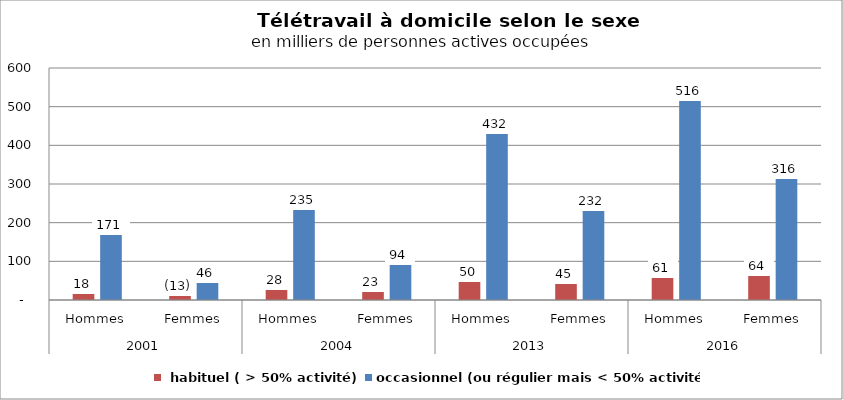
| Category |  habituel ( > 50% activité) | occasionnel (ou régulier mais < 50% activité) |
|---|---|---|
| 0 | 18.319 | 170.561 |
| 1 | 13.027 | 46.392 |
| 2 | 28.41 | 235.487 |
| 3 | 23.255 | 93.541 |
| 4 | 49.817 | 431.872 |
| 5 | 44.586 | 232.221 |
| 6 | 60.632 | 516.209 |
| 7 | 64.183 | 315.979 |